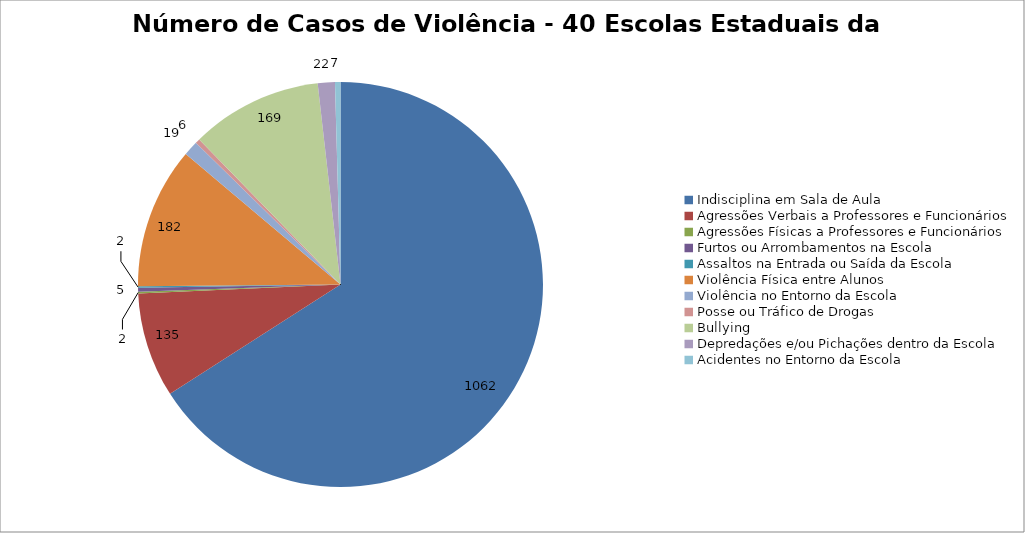
| Category | Número de Casos |
|---|---|
| Indisciplina em Sala de Aula | 1062 |
| Agressões Verbais a Professores e Funcionários | 135 |
| Agressões Físicas a Professores e Funcionários | 2 |
| Furtos ou Arrombamentos na Escola | 5 |
| Assaltos na Entrada ou Saída da Escola | 2 |
| Violência Física entre Alunos | 182 |
| Violência no Entorno da Escola | 19 |
| Posse ou Tráfico de Drogas | 6 |
| Bullying | 169 |
| Depredações e/ou Pichações dentro da Escola | 22 |
| Acidentes no Entorno da Escola | 7 |